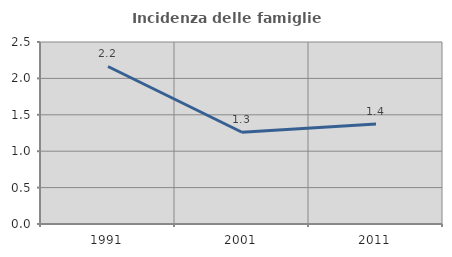
| Category | Incidenza delle famiglie numerose |
|---|---|
| 1991.0 | 2.164 |
| 2001.0 | 1.26 |
| 2011.0 | 1.374 |